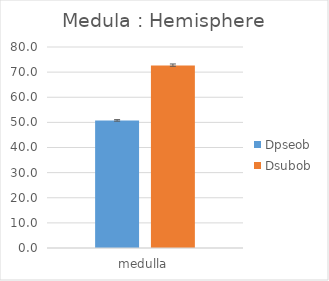
| Category | Dpseob | Dsubob |
|---|---|---|
| medulla | 50.789 | 72.635 |